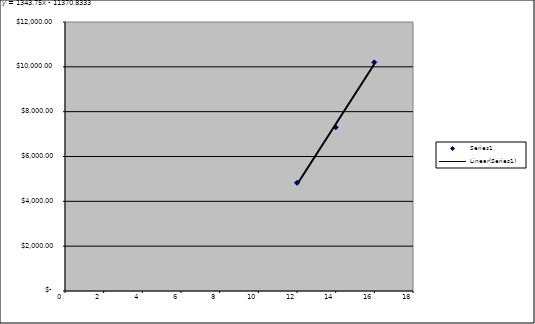
| Category | Series 0 |
|---|---|
| 12.0 | 4825 |
| 14.0 | 7300 |
| 16.0 | 10200 |